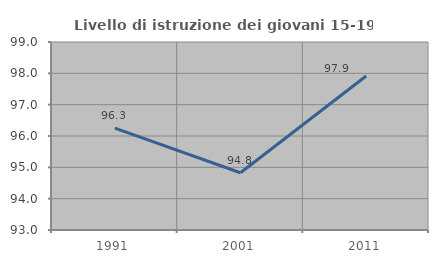
| Category | Livello di istruzione dei giovani 15-19 anni |
|---|---|
| 1991.0 | 96.25 |
| 2001.0 | 94.828 |
| 2011.0 | 97.917 |